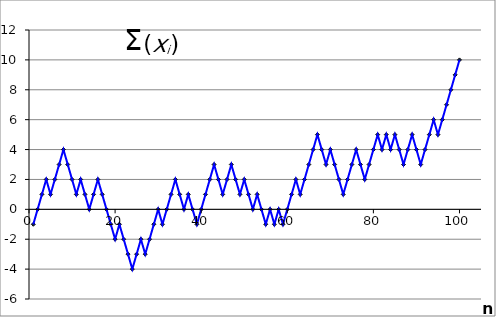
| Category | "Szum(n)" |
|---|---|
| 1.0 | -1 |
| 2.0 | 0 |
| 3.0 | 1 |
| 4.0 | 2 |
| 5.0 | 1 |
| 6.0 | 2 |
| 7.0 | 3 |
| 8.0 | 4 |
| 9.0 | 3 |
| 10.0 | 2 |
| 11.0 | 1 |
| 12.0 | 2 |
| 13.0 | 1 |
| 14.0 | 0 |
| 15.0 | 1 |
| 16.0 | 2 |
| 17.0 | 1 |
| 18.0 | 0 |
| 19.0 | -1 |
| 20.0 | -2 |
| 21.0 | -1 |
| 22.0 | -2 |
| 23.0 | -3 |
| 24.0 | -4 |
| 25.0 | -3 |
| 26.0 | -2 |
| 27.0 | -3 |
| 28.0 | -2 |
| 29.0 | -1 |
| 30.0 | 0 |
| 31.0 | -1 |
| 32.0 | 0 |
| 33.0 | 1 |
| 34.0 | 2 |
| 35.0 | 1 |
| 36.0 | 0 |
| 37.0 | 1 |
| 38.0 | 0 |
| 39.0 | -1 |
| 40.0 | 0 |
| 41.0 | 1 |
| 42.0 | 2 |
| 43.0 | 3 |
| 44.0 | 2 |
| 45.0 | 1 |
| 46.0 | 2 |
| 47.0 | 3 |
| 48.0 | 2 |
| 49.0 | 1 |
| 50.0 | 2 |
| 51.0 | 1 |
| 52.0 | 0 |
| 53.0 | 1 |
| 54.0 | 0 |
| 55.0 | -1 |
| 56.0 | 0 |
| 57.0 | -1 |
| 58.0 | 0 |
| 59.0 | -1 |
| 60.0 | 0 |
| 61.0 | 1 |
| 62.0 | 2 |
| 63.0 | 1 |
| 64.0 | 2 |
| 65.0 | 3 |
| 66.0 | 4 |
| 67.0 | 5 |
| 68.0 | 4 |
| 69.0 | 3 |
| 70.0 | 4 |
| 71.0 | 3 |
| 72.0 | 2 |
| 73.0 | 1 |
| 74.0 | 2 |
| 75.0 | 3 |
| 76.0 | 4 |
| 77.0 | 3 |
| 78.0 | 2 |
| 79.0 | 3 |
| 80.0 | 4 |
| 81.0 | 5 |
| 82.0 | 4 |
| 83.0 | 5 |
| 84.0 | 4 |
| 85.0 | 5 |
| 86.0 | 4 |
| 87.0 | 3 |
| 88.0 | 4 |
| 89.0 | 5 |
| 90.0 | 4 |
| 91.0 | 3 |
| 92.0 | 4 |
| 93.0 | 5 |
| 94.0 | 6 |
| 95.0 | 5 |
| 96.0 | 6 |
| 97.0 | 7 |
| 98.0 | 8 |
| 99.0 | 9 |
| 100.0 | 10 |